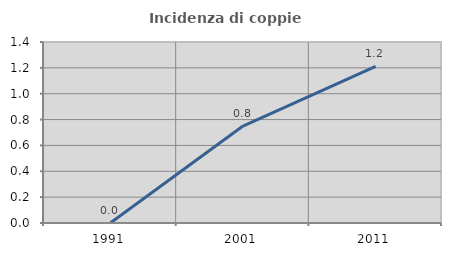
| Category | Incidenza di coppie miste |
|---|---|
| 1991.0 | 0 |
| 2001.0 | 0.75 |
| 2011.0 | 1.212 |